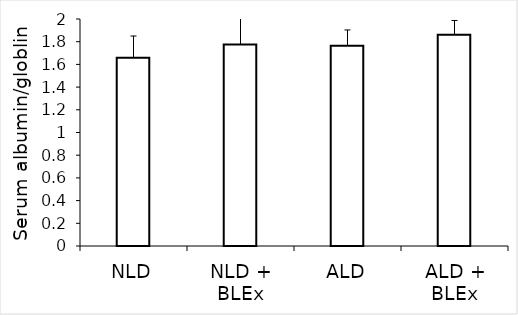
| Category | Series 0 |
|---|---|
| NLD | 1.658 |
| NLD + BLEx | 1.776 |
| ALD | 1.764 |
| ALD + BLEx | 1.861 |